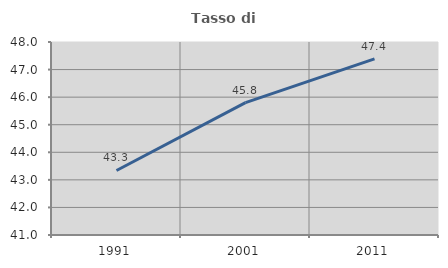
| Category | Tasso di occupazione   |
|---|---|
| 1991.0 | 43.34 |
| 2001.0 | 45.801 |
| 2011.0 | 47.387 |